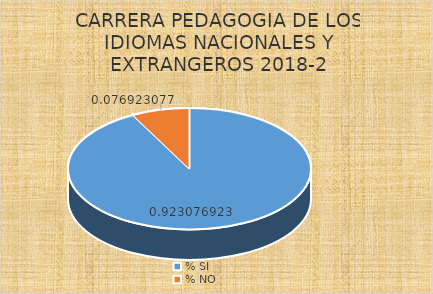
| Category | Series 0 |
|---|---|
| % SI | 0.923 |
| % NO | 0.077 |